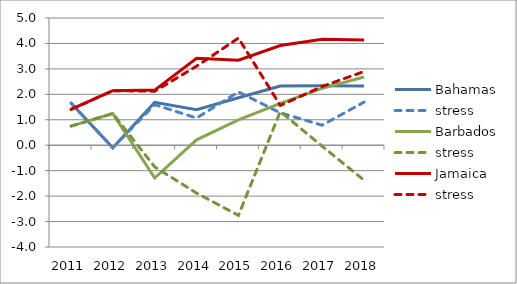
| Category | Bahamas | stress | Barbados | Jamaica |
|---|---|---|---|---|
| 2011.0 | 1.663 | 1.405 | 0.749 | 1.405 |
| 2012.0 | -0.097 | 2.145 | 1.244 | 2.145 |
| 2013.0 | 1.688 | 2.122 | -1.29 | 2.167 |
| 2014.0 | 1.392 | 3.106 | 0.212 | 3.414 |
| 2015.0 | 1.864 | 4.21 | 0.994 | 3.344 |
| 2016.0 | 2.328 | 1.562 | 1.646 | 3.919 |
| 2017.0 | 2.339 | 2.309 | 2.236 | 4.16 |
| 2018.0 | 2.324 | 2.897 | 2.679 | 4.131 |